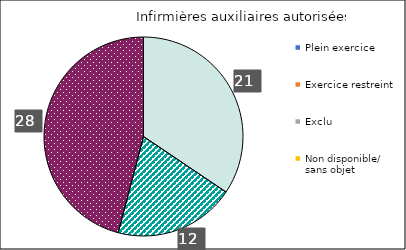
| Category | Infirmières auxiliaires autorisées | Infirmières praticiennes | Infirmières autorisées |
|---|---|---|---|
| Plein exercice | 21 | 0 | 24 |
| Exercice restreint | 12 | 0 | 18 |
| Exclu | 28 | 0 | 19 |
| Non disponible/
sans objet | 0 | 0 | 0 |